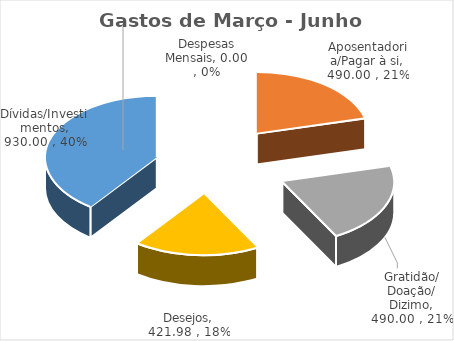
| Category | Gastos de Junho - Real Acumulado |
|---|---|
| Despesas Mensais | 0 |
| Aposentadoria/Pagar à si | 490 |
| Gratidão/ Doação/ Dizimo | 490 |
| Desejos | 421.98 |
| Dívidas/Investimentos | 930 |